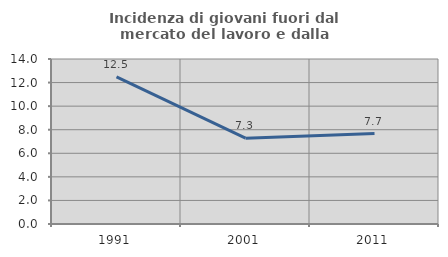
| Category | Incidenza di giovani fuori dal mercato del lavoro e dalla formazione  |
|---|---|
| 1991.0 | 12.489 |
| 2001.0 | 7.278 |
| 2011.0 | 7.67 |